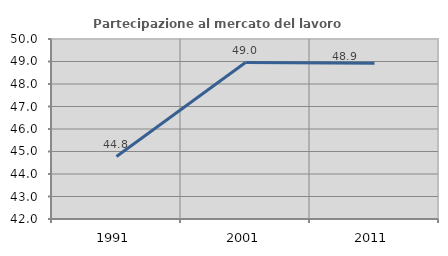
| Category | Partecipazione al mercato del lavoro  femminile |
|---|---|
| 1991.0 | 44.777 |
| 2001.0 | 48.954 |
| 2011.0 | 48.927 |